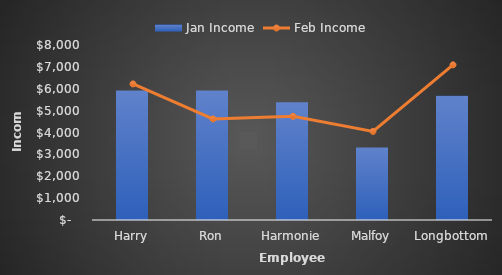
| Category | Jan Income |
|---|---|
| Harry | 5924.95 |
| Ron | 5924.95 |
| Harmonie | 5384.35 |
| Malfoy | 3318.35 |
| Longbottom | 5674.6 |